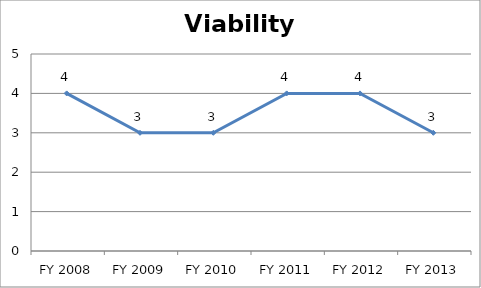
| Category | Viability score |
|---|---|
| FY 2013 | 3 |
| FY 2012 | 4 |
| FY 2011 | 4 |
| FY 2010 | 3 |
| FY 2009 | 3 |
| FY 2008 | 4 |